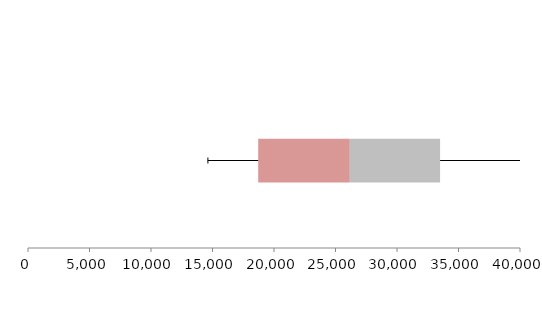
| Category | Series 1 | Series 2 | Series 3 |
|---|---|---|---|
| 0 | 18717.917 | 7446.524 | 7339.252 |